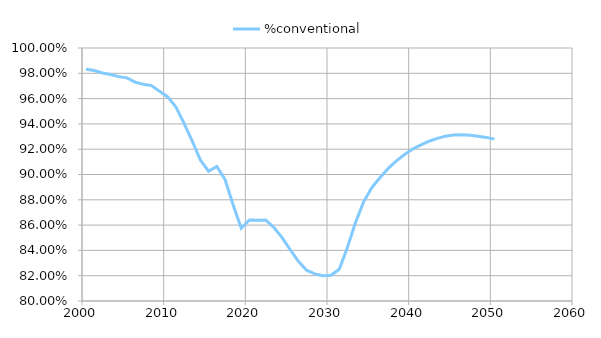
| Category | %conventional |
|---|---|
| 2000.5 | 0.983 |
| 2001.5 | 0.982 |
| 2002.5 | 0.98 |
| 2003.5 | 0.979 |
| 2004.5 | 0.977 |
| 2005.5 | 0.976 |
| 2006.5 | 0.973 |
| 2007.5 | 0.971 |
| 2008.5 | 0.97 |
| 2009.5 | 0.966 |
| 2010.5 | 0.961 |
| 2011.5 | 0.953 |
| 2012.5 | 0.94 |
| 2013.5 | 0.926 |
| 2014.5 | 0.911 |
| 2015.5 | 0.903 |
| 2016.5 | 0.906 |
| 2017.5 | 0.896 |
| 2018.5 | 0.876 |
| 2019.5 | 0.857 |
| 2020.5 | 0.864 |
| 2021.5 | 0.864 |
| 2022.5 | 0.864 |
| 2023.5 | 0.858 |
| 2024.5 | 0.85 |
| 2025.5 | 0.841 |
| 2026.5 | 0.831 |
| 2027.5 | 0.824 |
| 2028.5 | 0.821 |
| 2029.5 | 0.82 |
| 2030.5 | 0.82 |
| 2031.5 | 0.825 |
| 2032.5 | 0.842 |
| 2033.5 | 0.862 |
| 2034.5 | 0.879 |
| 2035.5 | 0.89 |
| 2036.5 | 0.898 |
| 2037.5 | 0.905 |
| 2038.5 | 0.911 |
| 2039.5 | 0.916 |
| 2040.5 | 0.92 |
| 2041.5 | 0.923 |
| 2042.5 | 0.926 |
| 2043.5 | 0.929 |
| 2044.5 | 0.93 |
| 2045.5 | 0.931 |
| 2046.5 | 0.931 |
| 2047.5 | 0.931 |
| 2048.5 | 0.93 |
| 2049.5 | 0.929 |
| 2050.5 | 0.928 |